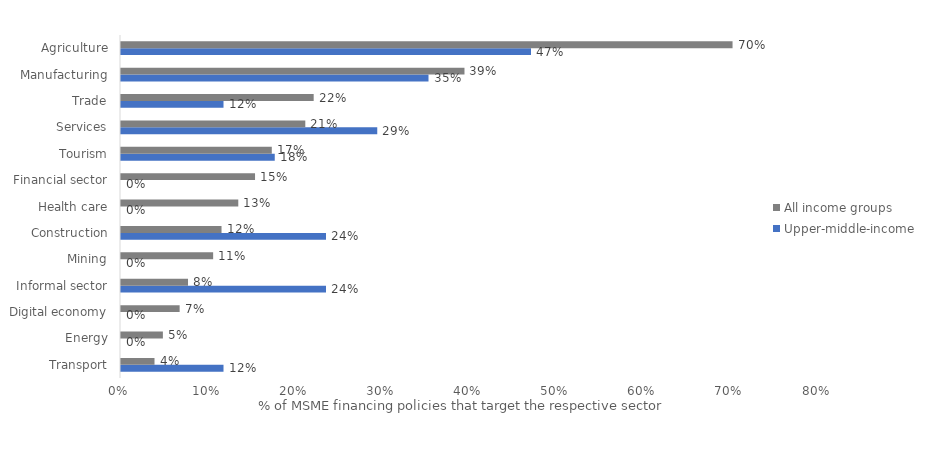
| Category | Upper-middle-income | All income groups |
|---|---|---|
| Transport | 0.118 | 0.038 |
| Energy | 0 | 0.048 |
| Digital economy | 0 | 0.067 |
| Informal sector | 0.235 | 0.077 |
| Mining | 0 | 0.106 |
| Construction | 0.235 | 0.115 |
| Health care | 0 | 0.135 |
| Financial sector | 0 | 0.154 |
| Tourism | 0.176 | 0.173 |
| Services | 0.294 | 0.212 |
| Trade | 0.118 | 0.221 |
| Manufacturing | 0.353 | 0.394 |
| Agriculture | 0.471 | 0.702 |